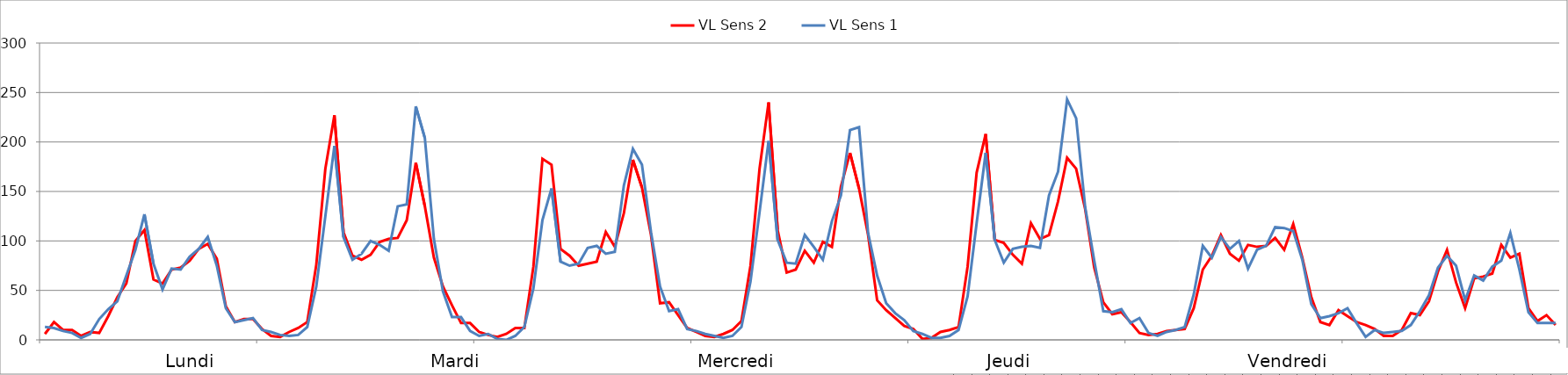
| Category | VL Sens 2 | VL Sens 1 |
|---|---|---|
| 0 | 6 | 13 |
| 1 | 18 | 12 |
| 2 | 10 | 9 |
| 3 | 10 | 7 |
| 4 | 4 | 2 |
| 5 | 8 | 6 |
| 6 | 7 | 21 |
| 7 | 24 | 31 |
| 8 | 43 | 39 |
| 9 | 57 | 65 |
| 10 | 100 | 91 |
| 11 | 111 | 127 |
| 12 | 61 | 77 |
| 13 | 57 | 51 |
| 14 | 71 | 72 |
| 15 | 73 | 71 |
| 16 | 80 | 84 |
| 17 | 92 | 92 |
| 18 | 97 | 104 |
| 19 | 82 | 75 |
| 20 | 34 | 32 |
| 21 | 18 | 18 |
| 22 | 21 | 20 |
| 23 | 21 | 22 |
| 24 | 11 | 10 |
| 25 | 4 | 8 |
| 26 | 3 | 5 |
| 27 | 8 | 4 |
| 28 | 12 | 5 |
| 29 | 18 | 13 |
| 30 | 76 | 54 |
| 31 | 173 | 125 |
| 32 | 227 | 196 |
| 33 | 109 | 104 |
| 34 | 85 | 81 |
| 35 | 81 | 87 |
| 36 | 86 | 100 |
| 37 | 99 | 96 |
| 38 | 102 | 90 |
| 39 | 103 | 135 |
| 40 | 121 | 137 |
| 41 | 179 | 236 |
| 42 | 135 | 204 |
| 43 | 83 | 102 |
| 44 | 54 | 49 |
| 45 | 35 | 23 |
| 46 | 17 | 23 |
| 47 | 17 | 9 |
| 48 | 8 | 4 |
| 49 | 5 | 6 |
| 50 | 3 | 1 |
| 51 | 6 | 0 |
| 52 | 12 | 4 |
| 53 | 12 | 13 |
| 54 | 74 | 52 |
| 55 | 183 | 121 |
| 56 | 177 | 153 |
| 57 | 92 | 79 |
| 58 | 85 | 75 |
| 59 | 75 | 77 |
| 60 | 77 | 93 |
| 61 | 79 | 95 |
| 62 | 109 | 87 |
| 63 | 94 | 89 |
| 64 | 128 | 156 |
| 65 | 182 | 193 |
| 66 | 154 | 177 |
| 67 | 106 | 109 |
| 68 | 37 | 54 |
| 69 | 38 | 29 |
| 70 | 25 | 31 |
| 71 | 12 | 11 |
| 72 | 8 | 9 |
| 73 | 4 | 6 |
| 74 | 3 | 4 |
| 75 | 6 | 2 |
| 76 | 10 | 4 |
| 77 | 19 | 13 |
| 78 | 75 | 59 |
| 79 | 173 | 129 |
| 80 | 240 | 201 |
| 81 | 111 | 101 |
| 82 | 68 | 78 |
| 83 | 71 | 77 |
| 84 | 90 | 106 |
| 85 | 78 | 94 |
| 86 | 99 | 81 |
| 87 | 94 | 120 |
| 88 | 155 | 146 |
| 89 | 189 | 212 |
| 90 | 153 | 215 |
| 91 | 106 | 108 |
| 92 | 40 | 65 |
| 93 | 30 | 37 |
| 94 | 22 | 27 |
| 95 | 14 | 20 |
| 96 | 11 | 9 |
| 97 | 1 | 6 |
| 98 | 2 | 2 |
| 99 | 8 | 2 |
| 100 | 10 | 4 |
| 101 | 13 | 10 |
| 102 | 74 | 44 |
| 103 | 169 | 118 |
| 104 | 208 | 189 |
| 105 | 101 | 101 |
| 106 | 98 | 78 |
| 107 | 86 | 92 |
| 108 | 77 | 94 |
| 109 | 118 | 95 |
| 110 | 102 | 93 |
| 111 | 106 | 146 |
| 112 | 140 | 170 |
| 113 | 184 | 243 |
| 114 | 173 | 224 |
| 115 | 132 | 134 |
| 116 | 73 | 80 |
| 117 | 38 | 29 |
| 118 | 26 | 28 |
| 119 | 28 | 31 |
| 120 | 18 | 17 |
| 121 | 7 | 22 |
| 122 | 5 | 7 |
| 123 | 6 | 4 |
| 124 | 9 | 8 |
| 125 | 10 | 10 |
| 126 | 11 | 13 |
| 127 | 32 | 46 |
| 128 | 71 | 95 |
| 129 | 85 | 83 |
| 130 | 106 | 104 |
| 131 | 87 | 92 |
| 132 | 80 | 100 |
| 133 | 96 | 72 |
| 134 | 94 | 91 |
| 135 | 95 | 95 |
| 136 | 103 | 114 |
| 137 | 91 | 113 |
| 138 | 117 | 110 |
| 139 | 83 | 81 |
| 140 | 43 | 36 |
| 141 | 18 | 22 |
| 142 | 15 | 24 |
| 143 | 30 | 27 |
| 144 | 24 | 32 |
| 145 | 18 | 17 |
| 146 | 15 | 3 |
| 147 | 11 | 10 |
| 148 | 4 | 7 |
| 149 | 4 | 8 |
| 150 | 10 | 9 |
| 151 | 27 | 15 |
| 152 | 25 | 29 |
| 153 | 39 | 45 |
| 154 | 69 | 73 |
| 155 | 91 | 85 |
| 156 | 58 | 75 |
| 157 | 32 | 40 |
| 158 | 62 | 65 |
| 159 | 64 | 60 |
| 160 | 67 | 74 |
| 161 | 96 | 80 |
| 162 | 83 | 108 |
| 163 | 87 | 71 |
| 164 | 32 | 28 |
| 165 | 19 | 17 |
| 166 | 25 | 17 |
| 167 | 15 | 17 |